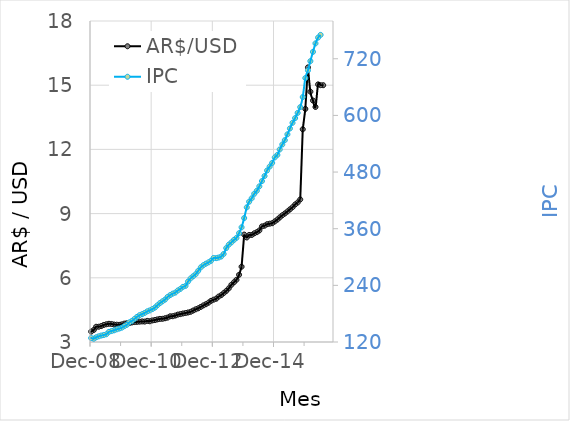
| Category | AR$/USD |
|---|---|
| 42583.0 | 15 |
| 42552.0 | 15.001 |
| 42522.0 | 15.038 |
| 42491.0 | 13.982 |
| 42461.0 | 14.285 |
| 42430.0 | 14.698 |
| 42401.0 | 15.832 |
| 42370.0 | 13.891 |
| 42339.0 | 12.94 |
| 42309.0 | 9.661 |
| 42278.0 | 9.518 |
| 42248.0 | 9.426 |
| 42217.0 | 9.299 |
| 42186.0 | 9.198 |
| 42156.0 | 9.099 |
| 42125.0 | 9.004 |
| 42095.0 | 8.922 |
| 42064.0 | 8.82 |
| 42036.0 | 8.722 |
| 42005.0 | 8.633 |
| 41974.0 | 8.55 |
| 41944.0 | 8.528 |
| 41913.0 | 8.503 |
| 41883.0 | 8.434 |
| 41852.0 | 8.401 |
| 41821.0 | 8.214 |
| 41791.0 | 8.132 |
| 41760.0 | 8.078 |
| 41730.0 | 8.001 |
| 41699.0 | 8.001 |
| 41671.0 | 7.886 |
| 41640.0 | 8.019 |
| 41609.0 | 6.518 |
| 41579.0 | 6.14 |
| 41548.0 | 5.908 |
| 41518.0 | 5.791 |
| 41487.0 | 5.671 |
| 41456.0 | 5.506 |
| 41426.0 | 5.386 |
| 41395.0 | 5.284 |
| 41365.0 | 5.188 |
| 41334.0 | 5.121 |
| 41306.0 | 5.022 |
| 41275.0 | 4.978 |
| 41244.0 | 4.924 |
| 41214.0 | 4.837 |
| 41183.0 | 4.764 |
| 41153.0 | 4.71 |
| 41122.0 | 4.638 |
| 41091.0 | 4.574 |
| 41061.0 | 4.527 |
| 41030.0 | 4.468 |
| 41000.0 | 4.411 |
| 40969.0 | 4.379 |
| 40940.0 | 4.354 |
| 40909.0 | 4.332 |
| 40878.0 | 4.303 |
| 40848.0 | 4.281 |
| 40817.0 | 4.236 |
| 40787.0 | 4.205 |
| 40756.0 | 4.2 |
| 40725.0 | 4.138 |
| 40695.0 | 4.108 |
| 40664.0 | 4.083 |
| 40634.0 | 4.08 |
| 40603.0 | 4.055 |
| 40575.0 | 4.027 |
| 40544.0 | 4.008 |
| 40513.0 | 3.97 |
| 40483.0 | 3.987 |
| 40452.0 | 3.954 |
| 40422.0 | 3.961 |
| 40391.0 | 3.95 |
| 40360.0 | 3.941 |
| 40330.0 | 3.932 |
| 40299.0 | 3.914 |
| 40269.0 | 3.885 |
| 40238.0 | 3.874 |
| 40210.0 | 3.858 |
| 40179.0 | 3.824 |
| 40148.0 | 3.801 |
| 40118.0 | 3.808 |
| 40087.0 | 3.816 |
| 40057.0 | 3.843 |
| 40026.0 | 3.85 |
| 39995.0 | 3.828 |
| 39965.0 | 3.798 |
| 39934.0 | 3.746 |
| 39904.0 | 3.714 |
| 39873.0 | 3.712 |
| 39845.0 | 3.563 |
| 39814.0 | 3.486 |
| 39783.0 | 3.454 |
| 39753.0 | 3.371 |
| 39722.0 | 3.386 |
| 39692.0 | 3.134 |
| 39661.0 | 3.031 |
| 39630.0 | 3.045 |
| 39600.0 | 3.024 |
| 39569.0 | 3.098 |
| 39539.0 | 3.164 |
| 39508.0 | 3.168 |
| 39479.0 | 3.16 |
| 39448.0 | 3.158 |
| 39417.0 | 3.15 |
| 39387.0 | 3.145 |
| 39356.0 | 3.141 |
| 39326.0 | 3.149 |
| 39295.0 | 3.156 |
| 39264.0 | 3.124 |
| 39234.0 | 3.092 |
| 39203.0 | 3.076 |
| 39173.0 | 3.09 |
| 39142.0 | 3.099 |
| 39114.0 | 3.1 |
| 39083.0 | 3.109 |
| 39052.0 | 3.059 |
| 39022.0 | 3.072 |
| 38991.0 | 3.088 |
| 38961.0 | 3.104 |
| 38930.0 | 3.096 |
| 38899.0 | 3.072 |
| 38869.0 | 3.084 |
| 38838.0 | 3.086 |
| 38808.0 | 3.048 |
| 38777.0 | 3.081 |
| 38749.0 | 3.071 |
| 38718.0 | 3.066 |
| 38687.0 | 3.032 |
| 38657.0 | 2.966 |
| 38626.0 | 3.001 |
| 38596.0 | 2.909 |
| 38565.0 | 2.911 |
| 38534.0 | 2.862 |
| 38504.0 | 2.886 |
| 38473.0 | 2.882 |
| 38443.0 | 2.909 |
| 38412.0 | 2.916 |
| 38384.0 | 2.939 |
| 38353.0 | 2.921 |
| 38322.0 | 2.972 |
| 38292.0 | 2.945 |
| 38261.0 | 2.97 |
| 38231.0 | 2.98 |
| 38200.0 | 2.997 |
| 38169.0 | 2.98 |
| 38139.0 | 2.96 |
| 38108.0 | 2.961 |
| 38078.0 | 2.84 |
| 38047.0 | 2.86 |
| 38018.0 | 2.922 |
| 37987.0 | 2.928 |
| 37956.0 | 2.926 |
| 37926.0 | 2.995 |
| 37895.0 | 2.865 |
| 37865.0 | 2.918 |
| 37834.0 | 2.958 |
| 37803.0 | 2.918 |
| 37773.0 | 2.798 |
| 37742.0 | 2.848 |
| 37712.0 | 2.822 |
| 37681.0 | 2.972 |
| 37653.0 | 3.2 |
| 37622.0 | 3.205 |
| 37591.0 | 3.365 |